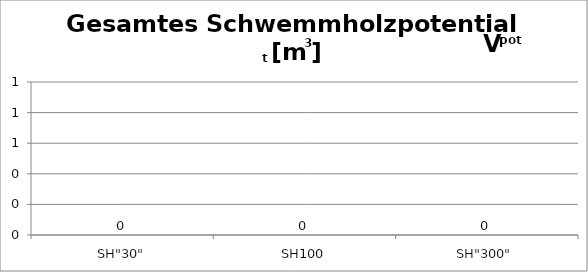
| Category | Schwemmholzpotential |
|---|---|
| SH"30" | 0 |
| SH100 | 0 |
| SH"300" | 0 |